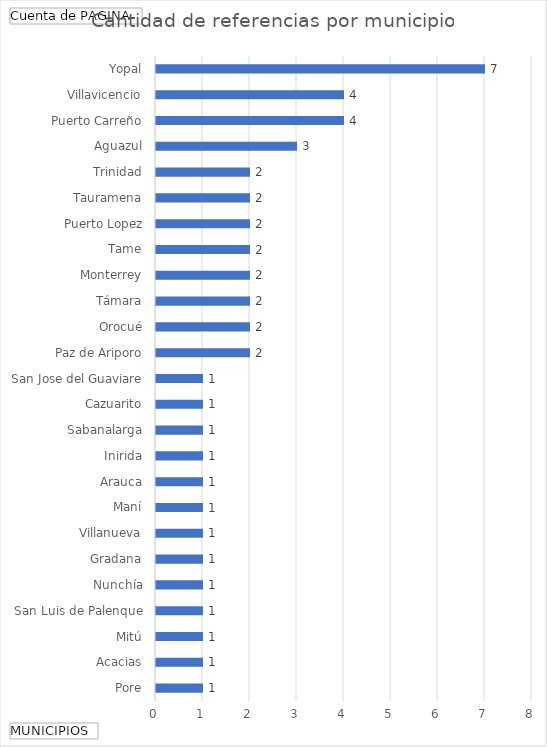
| Category | Total |
|---|---|
| Pore | 1 |
| Acacias | 1 |
| Mitú | 1 |
| San Luis de Palenque | 1 |
| Nunchía | 1 |
| Gradana | 1 |
| Villanueva | 1 |
| Maní | 1 |
| Arauca | 1 |
| Inirida | 1 |
| Sabanalarga | 1 |
| Cazuarito | 1 |
| San Jose del Guaviare | 1 |
| Paz de Ariporo | 2 |
| Orocué | 2 |
| Támara | 2 |
| Monterrey | 2 |
| Tame | 2 |
| Puerto Lopez | 2 |
| Tauramena | 2 |
| Trinidad | 2 |
| Aguazul | 3 |
| Puerto Carreño | 4 |
| Villavicencio | 4 |
| Yopal | 7 |